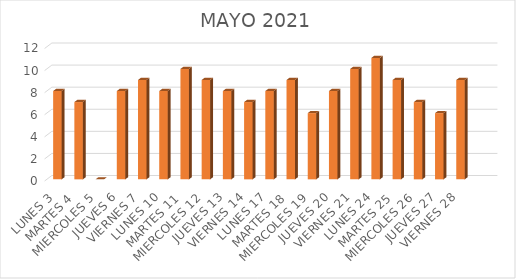
| Category | DIAS | PERSONAS ATENDIDAS | Series 1 |
|---|---|---|---|
| LUNES 3 |  |  | 8 |
| MARTES 4 |  |  | 7 |
| MIERCOLES 5 |  |  | 0 |
| JUEVES 6 |  |  | 8 |
| VIERNES 7 |  |  | 9 |
| LUNES 10 |  |  | 8 |
| MARTES 11 |  |  | 10 |
| MIERCOLES 12 |  |  | 9 |
| JUEVES 13 |  |  | 8 |
| VIERNES 14 |  |  | 7 |
| LUNES 17 |  |  | 8 |
| MARTES 18 |  |  | 9 |
| MIERCOLES 19 |  |  | 6 |
| JUEVES 20 |  |  | 8 |
| VIERNES 21 |  |  | 10 |
| LUNES 24 |  |  | 11 |
| MARTES 25 |  |  | 9 |
| MIERCOLES 26 |  |  | 7 |
| JUEVES 27 |  |  | 6 |
| VIERNES 28 |  |  | 9 |